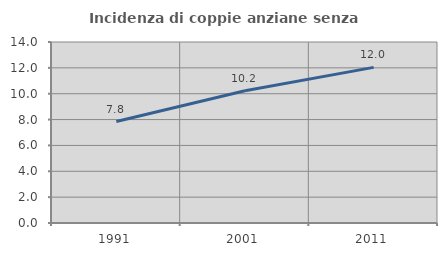
| Category | Incidenza di coppie anziane senza figli  |
|---|---|
| 1991.0 | 7.85 |
| 2001.0 | 10.233 |
| 2011.0 | 12.037 |